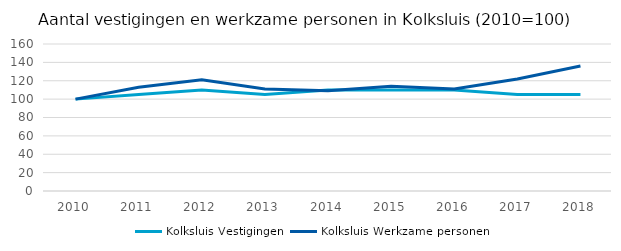
| Category | Kolksluis |
|---|---|
| 2010.0 | 100 |
| 2011.0 | 113 |
| 2012.0 | 121 |
| 2013.0 | 111 |
| 2014.0 | 109 |
| 2015.0 | 114 |
| 2016.0 | 111 |
| 2017.0 | 122 |
| 2018.0 | 136 |